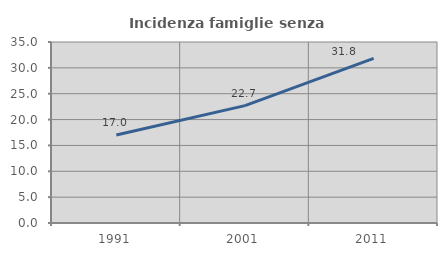
| Category | Incidenza famiglie senza nuclei |
|---|---|
| 1991.0 | 17.014 |
| 2001.0 | 22.702 |
| 2011.0 | 31.818 |